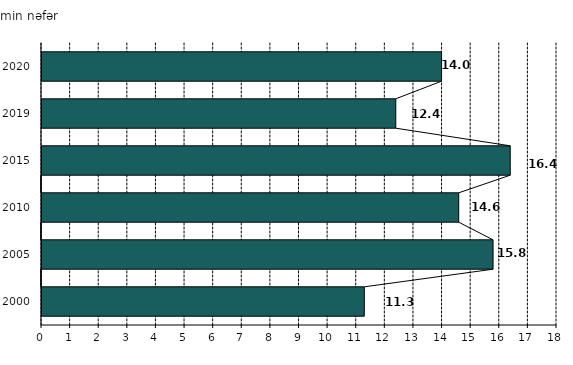
| Category | Orta ixtisas tцhsiдш | mъцssisцlцrini qurta- | ranlarэn sayэ  |
|---|---|---|---|
| 2000.0 |  |  | 11.3 |
| 2005.0 |  |  | 15.8 |
| 2010.0 |  |  | 14.6 |
| 2015.0 |  |  | 16.4 |
| 2019.0 |  |  | 12.4 |
| 2020.0 |  |  | 14 |